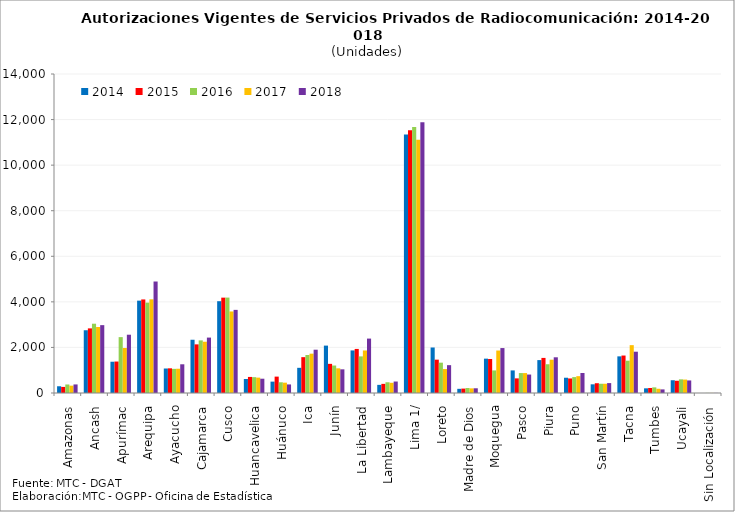
| Category | 2014 | 2015 | 2016 | 2017 | 2018 |
|---|---|---|---|---|---|
| Amazonas | 296 | 267 | 374 | 322 | 376 |
| Ancash | 2754 | 2836 | 3041 | 2896 | 2978 |
| Apurímac | 1372 | 1381 | 2452 | 1976 | 2558 |
| Arequipa | 4053 | 4106 | 3967 | 4111 | 4893 |
| Ayacucho | 1075 | 1083 | 1060 | 1065 | 1260 |
| Cajamarca | 2337 | 2134 | 2309 | 2250 | 2432 |
| Cusco | 4029 | 4185 | 4188 | 3578 | 3648 |
| Huancavelica | 615 | 705 | 695 | 675 | 627 |
| Huánuco | 499 | 719 | 470 | 453 | 376 |
| Ica | 1105 | 1573 | 1667 | 1726 | 1900 |
| Junín | 2080 | 1279 | 1206 | 1083 | 1039 |
| La Libertad | 1868 | 1934 | 1607 | 1867 | 2388 |
| Lambayeque | 357 | 401 | 471 | 448 | 504 |
| Lima 1/ | 11349 | 11530 | 11678 | 11113 | 11878 |
| Loreto | 1997 | 1463 | 1331 | 1051 | 1222 |
| Madre de Dios | 183 | 193 | 220 | 204 | 207 |
| Moquegua | 1507 | 1491 | 991 | 1864 | 1972 |
| Pasco | 991 | 642 | 875 | 874 | 810 |
| Piura | 1444 | 1540 | 1262 | 1461 | 1567 |
| Puno | 670 | 638 | 698 | 739 | 878 |
| San Martín | 381 | 429 | 406 | 406 | 435 |
| Tacna | 1608 | 1644 | 1417 | 2100 | 1812 |
| Tumbes | 205 | 219 | 247 | 186 | 158 |
| Ucayali | 560 | 537 | 599 | 589 | 551 |
| Sin Localización | 0 | 0 | 4 | 4 | 4 |